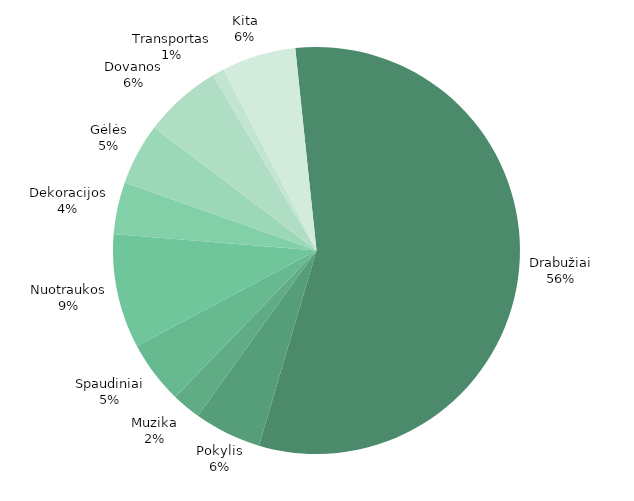
| Category | FAKTINĖS IŠLAIDOS |
|---|---|
| Drabužiai | 9770 |
| Pokylis | 928 |
| Muzika | 400 |
| Spaudiniai | 870 |
| Nuotraukos | 1575 |
| Dekoracijos | 720 |
| Gėlės | 850 |
| Dovanos | 1075 |
| Transportas | 165 |
| Kita | 1021 |